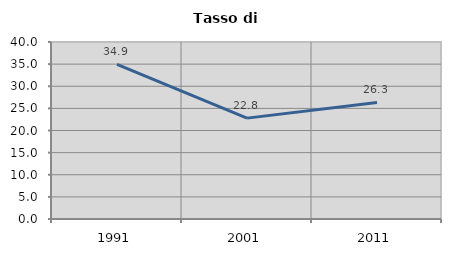
| Category | Tasso di disoccupazione   |
|---|---|
| 1991.0 | 34.932 |
| 2001.0 | 22.798 |
| 2011.0 | 26.344 |